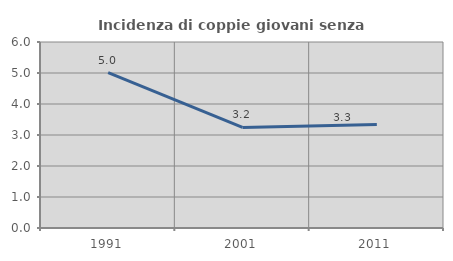
| Category | Incidenza di coppie giovani senza figli |
|---|---|
| 1991.0 | 5.014 |
| 2001.0 | 3.246 |
| 2011.0 | 3.34 |